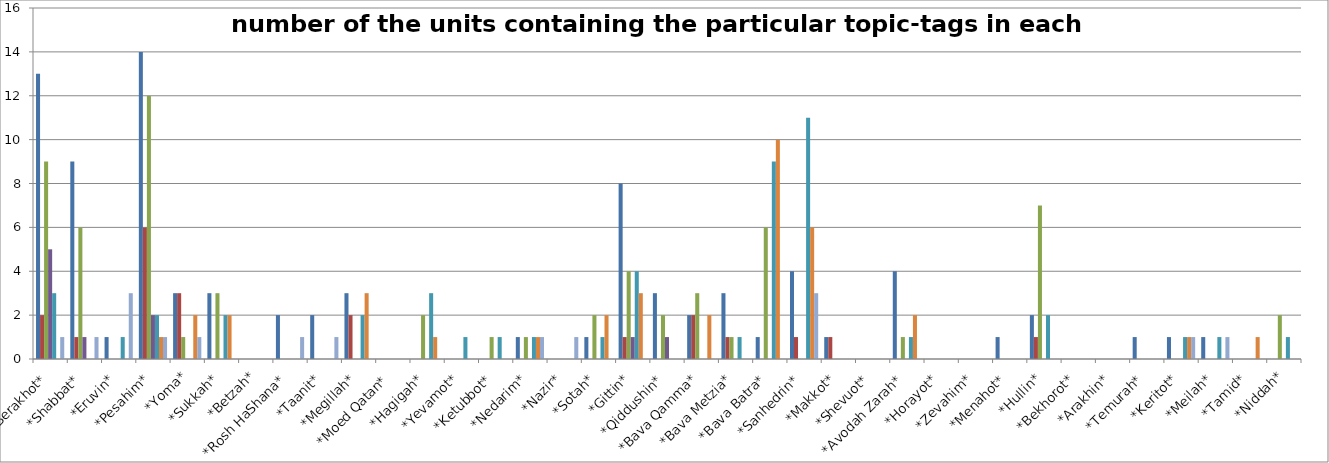
| Category | Series 0 | Series 1 | Series 2 | Series 3 | Series 4 | Series 5 | Series 6 |
|---|---|---|---|---|---|---|---|
| *Berakhot* | 13 | 2 | 9 | 5 | 3 | 0 | 1 |
| *Shabbat* | 9 | 1 | 6 | 1 | 0 | 0 | 1 |
| *Eruvin* | 1 | 0 | 0 | 0 | 1 | 0 | 3 |
| *Pesahim* | 14 | 6 | 12 | 2 | 2 | 1 | 1 |
| *Yoma* | 3 | 3 | 1 | 0 | 0 | 2 | 1 |
| *Sukkah* | 3 | 0 | 3 | 0 | 2 | 2 | 0 |
| *Betzah* | 0 | 0 | 0 | 0 | 0 | 0 | 0 |
| *Rosh HaShana* | 2 | 0 | 0 | 0 | 0 | 0 | 1 |
| *Taanit* | 2 | 0 | 0 | 0 | 0 | 0 | 1 |
| *Megillah* | 3 | 2 | 0 | 0 | 2 | 3 | 0 |
| *Moed Qatan* | 0 | 0 | 0 | 0 | 0 | 0 | 0 |
| *Hagigah* | 0 | 0 | 2 | 0 | 3 | 1 | 0 |
| *Yevamot* | 0 | 0 | 0 | 0 | 1 | 0 | 0 |
| *Ketubbot* | 0 | 0 | 1 | 0 | 1 | 0 | 0 |
| *Nedarim* | 1 | 0 | 1 | 0 | 1 | 1 | 1 |
| *Nazir* | 0 | 0 | 0 | 0 | 0 | 0 | 1 |
| *Sotah* | 1 | 0 | 2 | 0 | 1 | 2 | 0 |
| *Gittin* | 8 | 1 | 4 | 1 | 4 | 3 | 0 |
| *Qiddushin* | 3 | 0 | 2 | 1 | 0 | 0 | 0 |
| *Bava Qamma* | 2 | 2 | 3 | 0 | 0 | 2 | 0 |
| *Bava Metzia* | 3 | 1 | 1 | 0 | 1 | 0 | 0 |
| *Bava Batra* | 1 | 0 | 6 | 0 | 9 | 10 | 0 |
| *Sanhedrin* | 4 | 1 | 0 | 0 | 11 | 6 | 3 |
| *Makkot* | 1 | 1 | 0 | 0 | 0 | 0 | 0 |
| *Shevuot* | 0 | 0 | 0 | 0 | 0 | 0 | 0 |
| *Avodah Zarah* | 4 | 0 | 1 | 0 | 1 | 2 | 0 |
| *Horayot* | 0 | 0 | 0 | 0 | 0 | 0 | 0 |
| *Zevahim* | 0 | 0 | 0 | 0 | 0 | 0 | 0 |
| *Menahot* | 1 | 0 | 0 | 0 | 0 | 0 | 0 |
| *Hullin* | 2 | 1 | 7 | 0 | 2 | 0 | 0 |
| *Bekhorot* | 0 | 0 | 0 | 0 | 0 | 0 | 0 |
| *Arakhin* | 0 | 0 | 0 | 0 | 0 | 0 | 0 |
| *Temurah* | 1 | 0 | 0 | 0 | 0 | 0 | 0 |
| *Keritot* | 1 | 0 | 0 | 0 | 1 | 1 | 1 |
| *Meilah* | 1 | 0 | 0 | 0 | 1 | 0 | 1 |
| *Tamid* | 0 | 0 | 0 | 0 | 0 | 1 | 0 |
| *Niddah* | 0 | 0 | 2 | 0 | 1 | 0 | 0 |